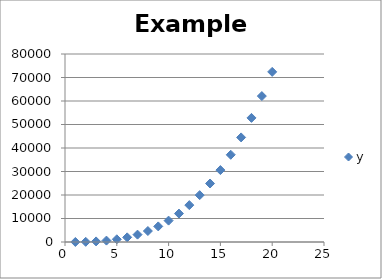
| Category | y |
|---|---|
| 1.0 | 10 |
| 2.0 | 76 |
| 3.0 | 252 |
| 4.0 | 592 |
| 5.0 | 1150 |
| 6.0 | 1980 |
| 7.0 | 3136 |
| 8.0 | 4672 |
| 9.0 | 6642 |
| 10.0 | 9100 |
| 11.0 | 12100 |
| 12.0 | 15696 |
| 13.0 | 19942 |
| 14.0 | 24892 |
| 15.0 | 30600 |
| 16.0 | 37120 |
| 17.0 | 44506 |
| 18.0 | 52812 |
| 19.0 | 62092 |
| 20.0 | 72400 |